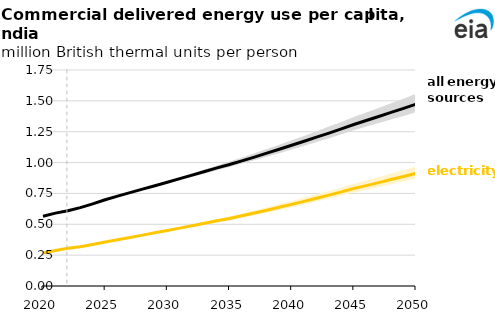
| Category | Commercial |
|---|---|
| 2020.0 | 0.268 |
| 2021.0 | 0.288 |
| 2022.0 | 0.305 |
| 2023.0 | 0.319 |
| 2024.0 | 0.337 |
| 2025.0 | 0.356 |
| 2026.0 | 0.375 |
| 2027.0 | 0.393 |
| 2028.0 | 0.412 |
| 2029.0 | 0.431 |
| 2030.0 | 0.45 |
| 2031.0 | 0.469 |
| 2032.0 | 0.489 |
| 2033.0 | 0.508 |
| 2034.0 | 0.528 |
| 2035.0 | 0.547 |
| 2036.0 | 0.569 |
| 2037.0 | 0.592 |
| 2038.0 | 0.614 |
| 2039.0 | 0.637 |
| 2040.0 | 0.661 |
| 2041.0 | 0.686 |
| 2042.0 | 0.711 |
| 2043.0 | 0.736 |
| 2044.0 | 0.763 |
| 2045.0 | 0.789 |
| 2046.0 | 0.813 |
| 2047.0 | 0.838 |
| 2048.0 | 0.862 |
| 2049.0 | 0.887 |
| 2050.0 | 0.912 |